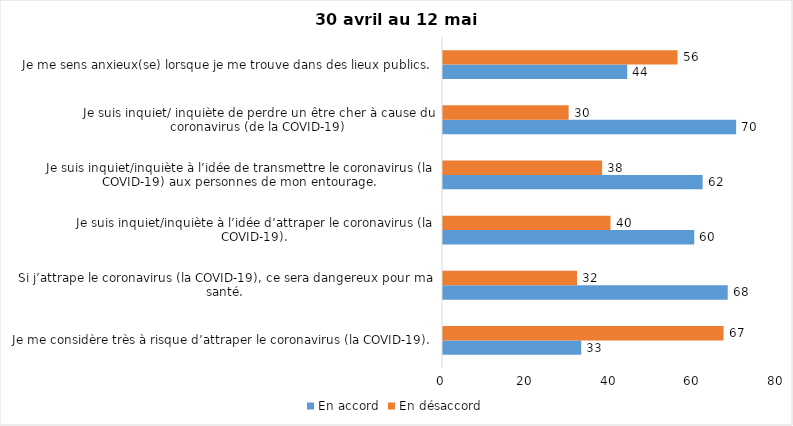
| Category | En accord | En désaccord |
|---|---|---|
| Je me considère très à risque d’attraper le coronavirus (la COVID-19). | 33 | 67 |
| Si j’attrape le coronavirus (la COVID-19), ce sera dangereux pour ma santé. | 68 | 32 |
| Je suis inquiet/inquiète à l’idée d’attraper le coronavirus (la COVID-19). | 60 | 40 |
| Je suis inquiet/inquiète à l’idée de transmettre le coronavirus (la COVID-19) aux personnes de mon entourage. | 62 | 38 |
| Je suis inquiet/ inquiète de perdre un être cher à cause du coronavirus (de la COVID-19) | 70 | 30 |
| Je me sens anxieux(se) lorsque je me trouve dans des lieux publics. | 44 | 56 |